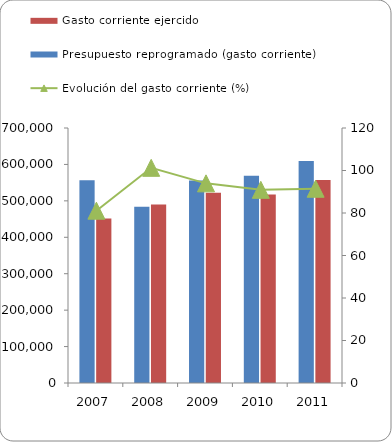
| Category | Presupuesto reprogramado (gasto corriente) | Gasto corriente ejercido |
|---|---|---|
| 2007 | 556895 | 451547 |
| 2008 | 483576 | 489675 |
| 2009 | 555570 | 521972 |
| 2010 | 569174 | 517487 |
| 2011 | 609286 | 556962 |